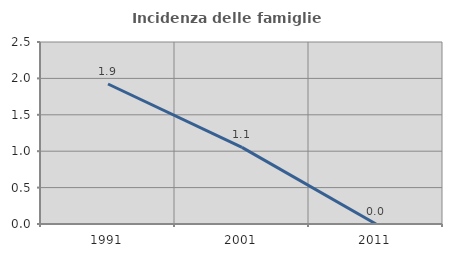
| Category | Incidenza delle famiglie numerose |
|---|---|
| 1991.0 | 1.923 |
| 2001.0 | 1.053 |
| 2011.0 | 0 |